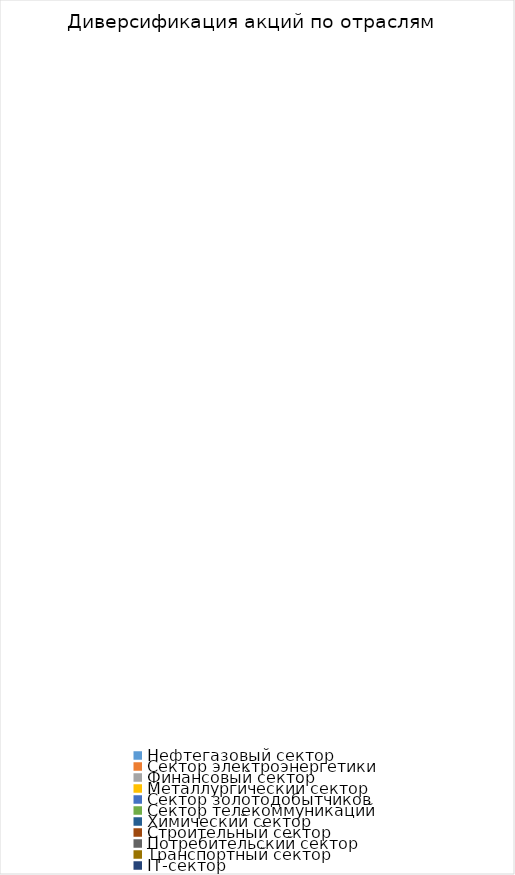
| Category | 1 |
|---|---|
| Нефтегазовый сектор | 0 |
| Сектор электроэнергетики | 0 |
| Финансовый сектор | 0 |
| Металлургический сектор | 0 |
| Сектор золотодобытчиков | 0 |
| Сектор телекоммуникаций | 0 |
| Химический сектор | 0 |
| Строительный сектор | 0 |
| Потребительский сектор | 0 |
| Транспортный сектор | 0 |
| IT-сектор | 0 |